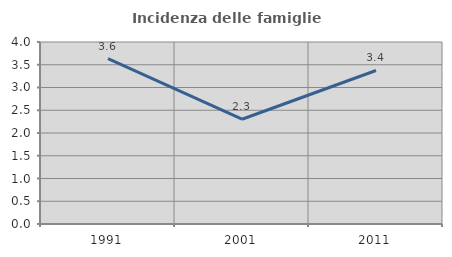
| Category | Incidenza delle famiglie numerose |
|---|---|
| 1991.0 | 3.636 |
| 2001.0 | 2.303 |
| 2011.0 | 3.374 |